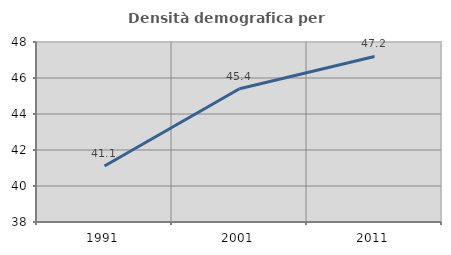
| Category | Densità demografica |
|---|---|
| 1991.0 | 41.111 |
| 2001.0 | 45.401 |
| 2011.0 | 47.196 |